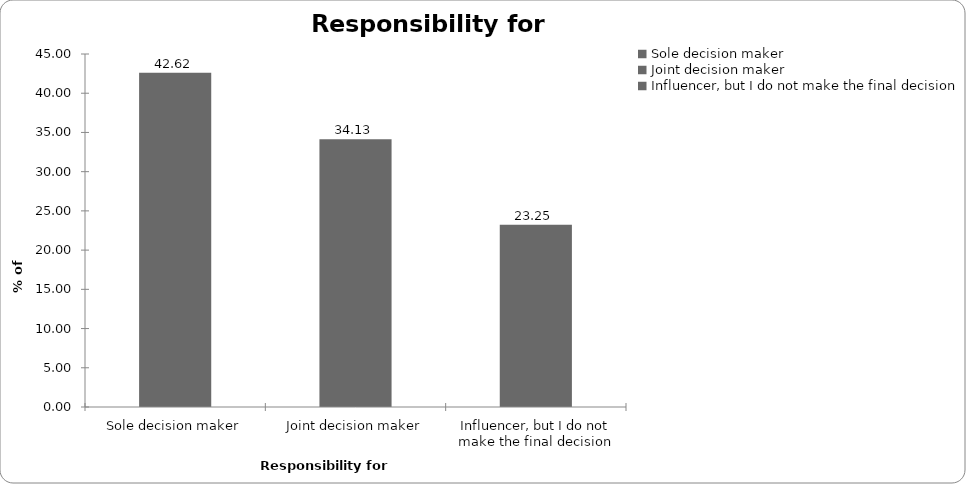
| Category | Responsibility for insurance |
|---|---|
| Sole decision maker | 42.619 |
| Joint decision maker | 34.135 |
| Influencer, but I do not make the final decision | 23.246 |